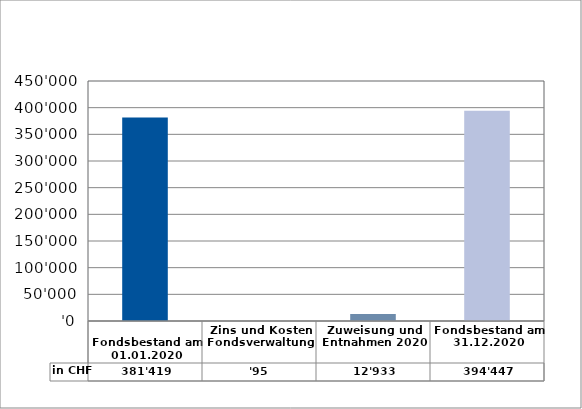
| Category | in CHF |
|---|---|
| 
Fondsbestand am 01.01.2020

 | 381419.05 |
| Zins und Kosten Fondsverwaltung | 95.35 |
| Zuweisung und Entnahmen 2020 | 12932.8 |
| Fondsbestand am 31.12.2020 | 394447.2 |